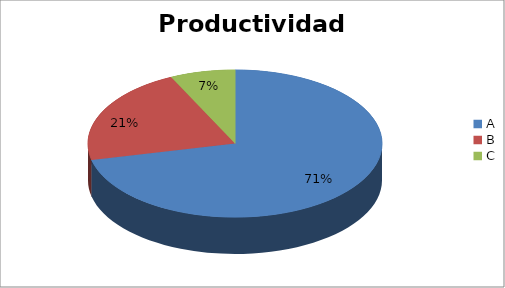
| Category | Series 0 |
|---|---|
| A | 71.429 |
| B | 21.429 |
| C | 7.143 |